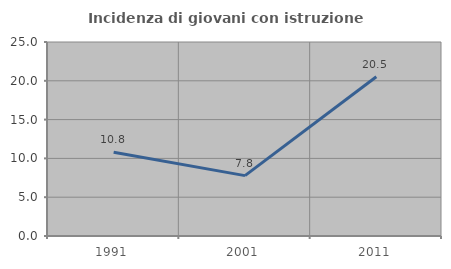
| Category | Incidenza di giovani con istruzione universitaria |
|---|---|
| 1991.0 | 10.784 |
| 2001.0 | 7.778 |
| 2011.0 | 20.513 |